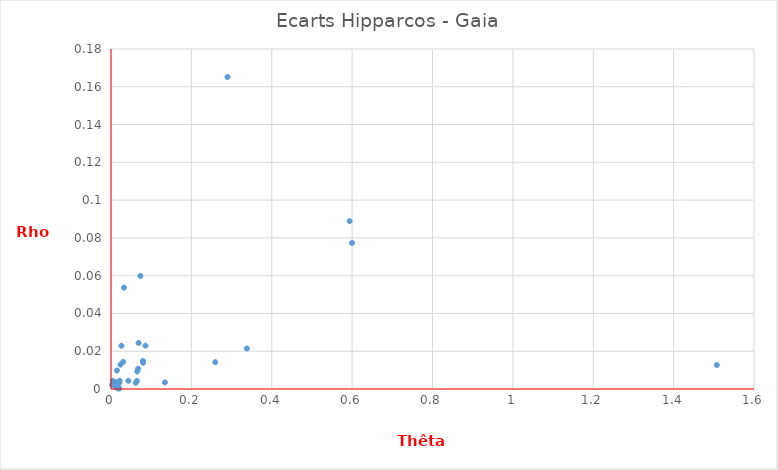
| Category | Ecarts |
|---|---|
| 0.004627105137757326 | 0.004 |
| 0.3380870827080571 | 0.021 |
| 0.06750788763776683 | 0.011 |
| 0.023487506308782713 | 0.013 |
| 0.011288147532013681 | 0.001 |
| 0.017308338310499494 | 0.001 |
| 0.02602325530398275 | 0.023 |
| 0.02067841082191535 | 0.003 |
| 0.020794267897207064 | 0 |
| 0.061436474832021304 | 0.003 |
| 0.014849578238283812 | 0.01 |
| 0.28988810368046103 | 0.165 |
| 0.021568469941517066 | 0.004 |
| 0.13418075659105178 | 0.003 |
| 0.06876161520449386 | 0.024 |
| 0.06542873762185764 | 0.009 |
| 0.07987641278288038 | 0.014 |
| 0.5938697754609024 | 0.089 |
| 0.030449351377427547 | 0.014 |
| 0.2595938661187347 | 0.014 |
| 0.07957352578765153 | 0.015 |
| 1.507492242227812 | 0.013 |
| 0.07301978602119696 | 0.06 |
| 0.06449523140313573 | 0.004 |
| 0.08578152383202564 | 0.023 |
| 0.010802558355962333 | 0.004 |
| 0.0022982518887104675 | 0.002 |
| 0.03217526363999923 | 0.054 |
| 0.017315947440408763 | 0 |
| 0.01701501014662199 | 0 |
| 0.043062903723011914 | 0.004 |
| 0.5997718269280767 | 0.077 |